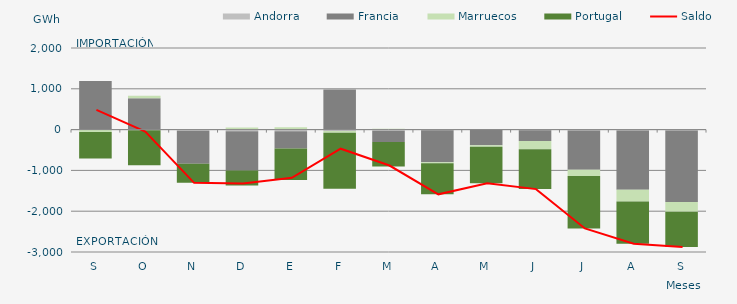
| Category | Andorra | Francia | Marruecos | Portugal |
|---|---|---|---|---|
| S | -11.131 | 1193.426 | -45.19 | -654.794 |
| O | -15.195 | 769.066 | 59.008 | -860.78 |
| N | -28.632 | -809.352 | -1.998 | -465.164 |
| D | -40.654 | -959.109 | 48.514 | -372.253 |
| E | -38.484 | -427.138 | 57.119 | -771.475 |
| F | -34.803 | 984.059 | -44.168 | -1373 |
| M | -31.125 | -269.835 | 22.023 | -601.362 |
| A | -16.536 | -782.902 | -22.588 | -764.882 |
| M | -5.354 | -378.945 | -37.987 | -891.537 |
| J | -16.539 | -262.937 | -205.078 | -974.176 |
| J | -22.256 | -963.789 | -152.863 | -1283.78 |
| A | -20.355 | -1451.936 | -291.598 | -1034.215 |
| S | -19.779 | -1752.3 | -243.405 | -861.179 |